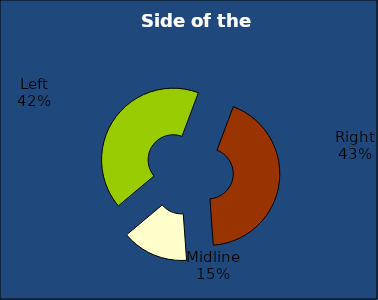
| Category | Series 0 |
|---|---|
| Left | 281 |
| Right | 290 |
| Midline | 101 |